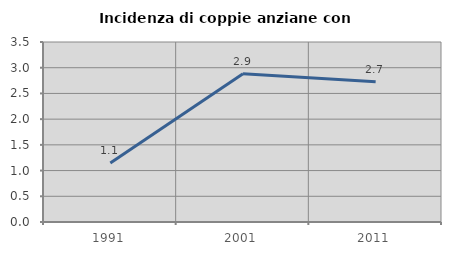
| Category | Incidenza di coppie anziane con figli |
|---|---|
| 1991.0 | 1.149 |
| 2001.0 | 2.885 |
| 2011.0 | 2.727 |